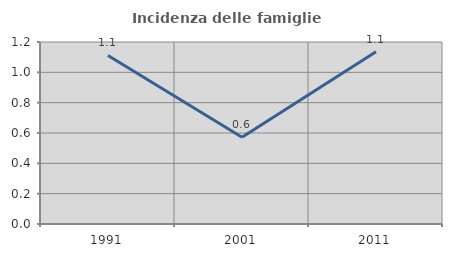
| Category | Incidenza delle famiglie numerose |
|---|---|
| 1991.0 | 1.111 |
| 2001.0 | 0.571 |
| 2011.0 | 1.136 |